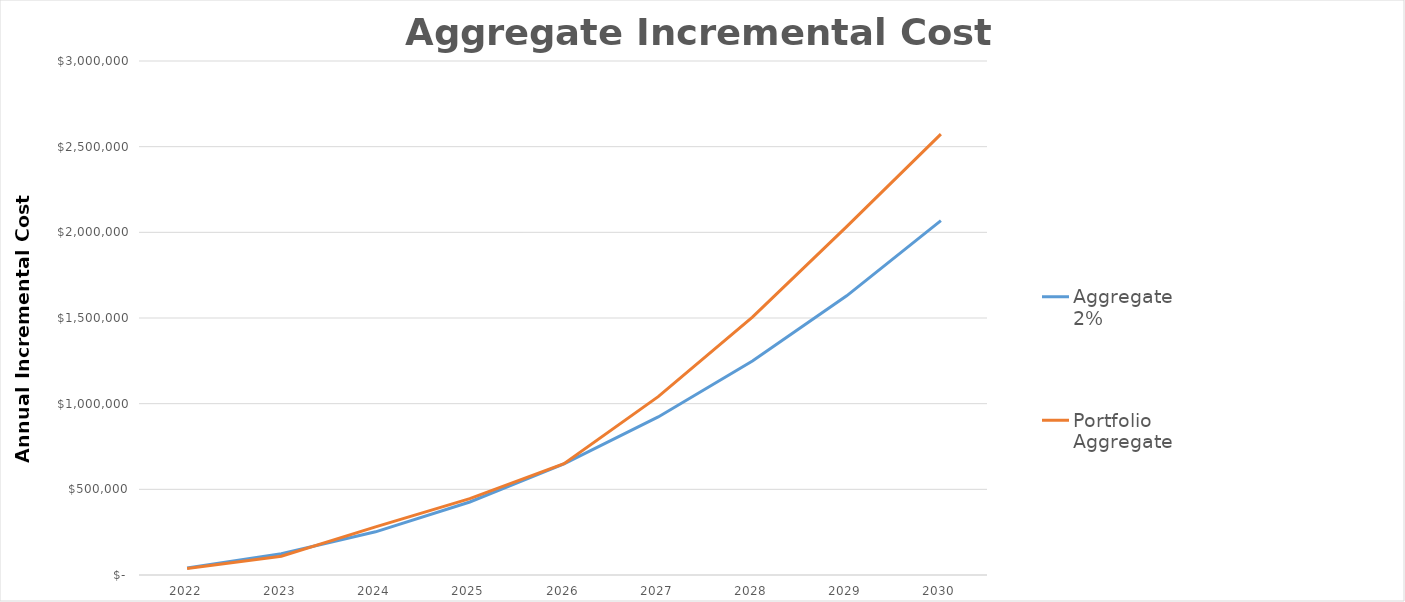
| Category | Aggregate 2% | Portfolio Aggregate |
|---|---|---|
| 2022.0 | 40761 | 38322.98 |
| 2023.0 | 124117.246 | 109512.778 |
| 2024.0 | 251965.143 | 280735.852 |
| 2025.0 | 426265.138 | 445494.626 |
| 2026.0 | 649043.65 | 649159.474 |
| 2027.0 | 922395.062 | 1041184.171 |
| 2028.0 | 1248483.767 | 1505466.176 |
| 2029.0 | 1629546.267 | 2033530.874 |
| 2030.0 | 2067893.338 | 2572966.487 |